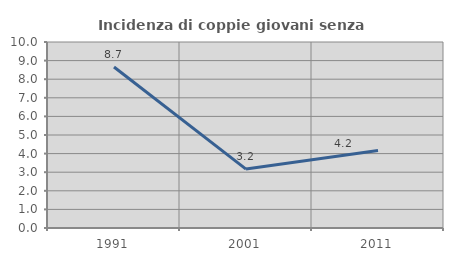
| Category | Incidenza di coppie giovani senza figli |
|---|---|
| 1991.0 | 8.654 |
| 2001.0 | 3.167 |
| 2011.0 | 4.167 |